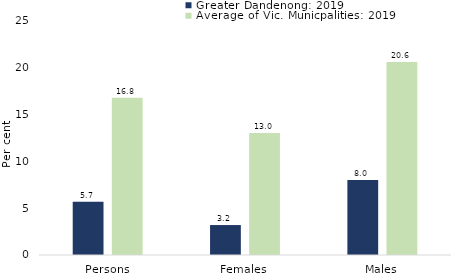
| Category | Greater Dandenong: 2019 | Average of Vic. Municpalities: 2019 |
|---|---|---|
| Persons | 5.7 | 16.803 |
| Females | 3.2 | 13.047 |
| Males | 8 | 20.613 |